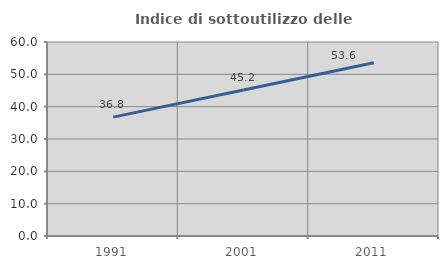
| Category | Indice di sottoutilizzo delle abitazioni  |
|---|---|
| 1991.0 | 36.76 |
| 2001.0 | 45.176 |
| 2011.0 | 53.56 |